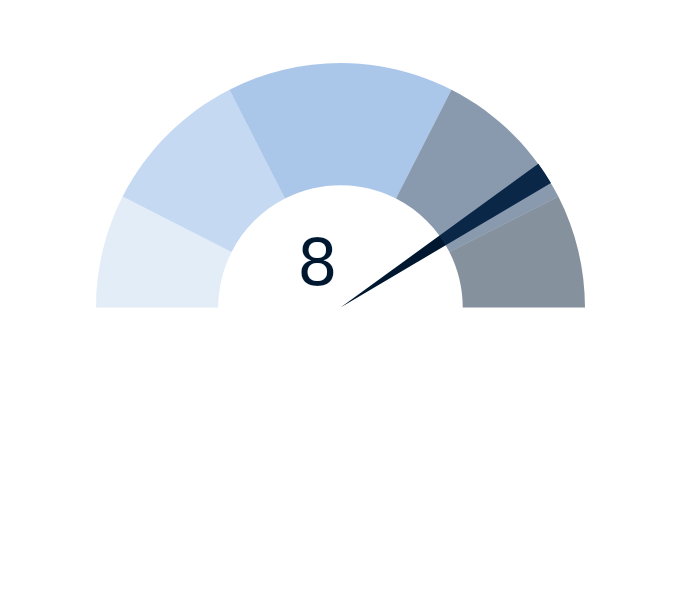
| Category | factor |
|---|---|
| 0 | 8 |
| 1 | 0.3 |
| 2 | 11.7 |